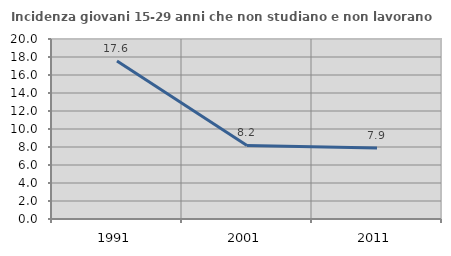
| Category | Incidenza giovani 15-29 anni che non studiano e non lavorano  |
|---|---|
| 1991.0 | 17.568 |
| 2001.0 | 8.172 |
| 2011.0 | 7.875 |